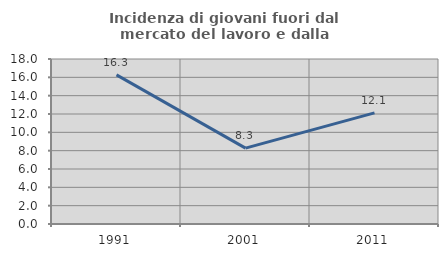
| Category | Incidenza di giovani fuori dal mercato del lavoro e dalla formazione  |
|---|---|
| 1991.0 | 16.265 |
| 2001.0 | 8.276 |
| 2011.0 | 12.121 |